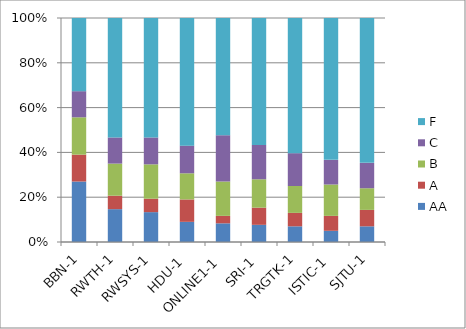
| Category | AA | A | B | C | F |
|---|---|---|---|---|---|
| _x0005_BBN-1 | 81 | 36 | 50 | 35 | 98 |
| _x0006_RWTH-1 | 44 | 18 | 43 | 35 | 160 |
| _x0007_RWSYS-1 | 40 | 18 | 46 | 36 | 160 |
| _x0005_HDU-1 | 27 | 30 | 35 | 37 | 171 |
| 	ONLINE1-1 | 25 | 10 | 46 | 62 | 157 |
| _x0005_SRI-1 | 23 | 23 | 38 | 46 | 170 |
| _x0007_TRGTK-1 | 21 | 18 | 36 | 44 | 181 |
| _x0007_ISTIC-1 | 15 | 20 | 42 | 33 | 190 |
| _x0006_SJTU-1 | 21 | 22 | 29 | 34 | 194 |